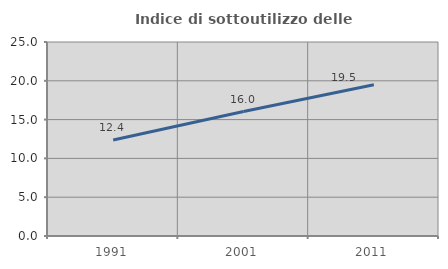
| Category | Indice di sottoutilizzo delle abitazioni  |
|---|---|
| 1991.0 | 12.376 |
| 2001.0 | 16.034 |
| 2011.0 | 19.488 |